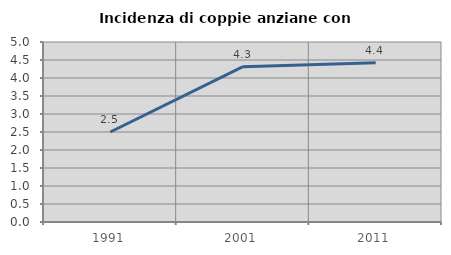
| Category | Incidenza di coppie anziane con figli |
|---|---|
| 1991.0 | 2.5 |
| 2001.0 | 4.316 |
| 2011.0 | 4.421 |